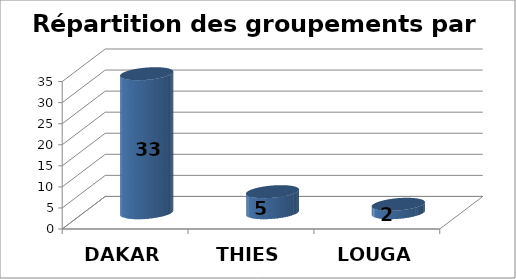
| Category | Series 0 | Series 1 |
|---|---|---|
| DAKAR | 33 |  |
| THIES | 5 |  |
| LOUGA | 2 |  |